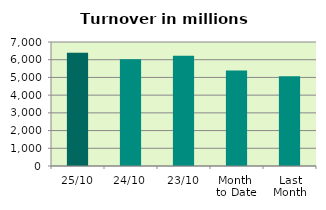
| Category | Series 0 |
|---|---|
| 25/10 | 6397.654 |
| 24/10 | 6030.947 |
| 23/10 | 6222.023 |
| Month 
to Date | 5391.612 |
| Last
Month | 5068.328 |